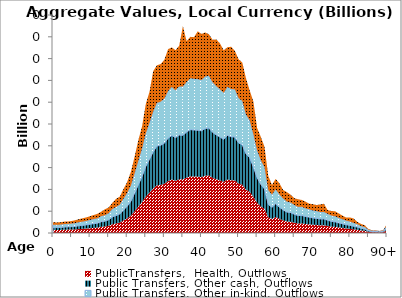
| Category | PublicTransfers,  Health, Outflows | Public Transfers, Other cash, Outflows | Public Transfers, Other in-kind, Outflows | Public Transfers, Education, Outflows |
|---|---|---|---|---|
| 0 | 2.731 | 2.25 | 2.478 | 2.452 |
|  | 2.744 | 2.26 | 2.489 | 2.201 |
| 2 | 2.826 | 2.328 | 2.564 | 2.172 |
| 3 | 2.982 | 2.457 | 2.705 | 2.274 |
| 4 | 3.1 | 2.554 | 2.812 | 2.103 |
| 5 | 3.17 | 2.611 | 2.875 | 2.311 |
| 6 | 3.329 | 2.742 | 3.019 | 2.653 |
| 7 | 3.641 | 2.999 | 3.302 | 2.783 |
| 8 | 3.832 | 3.156 | 3.476 | 3.053 |
| 9 | 4.082 | 3.362 | 3.703 | 3.218 |
| 10 | 4.401 | 3.625 | 3.992 | 3.378 |
| 11 | 4.707 | 3.877 | 4.27 | 3.681 |
| 12 | 4.965 | 4.089 | 4.504 | 4.091 |
| 13 | 5.682 | 4.68 | 5.154 | 4.089 |
| 14 | 5.973 | 4.92 | 5.418 | 5.479 |
| 15 | 6.666 | 5.49 | 6.046 | 5.256 |
| 16 | 8.071 | 6.648 | 7.321 | 5.601 |
| 17 | 8.764 | 7.219 | 7.95 | 7.408 |
| 18 | 9.546 | 7.863 | 8.659 | 7.331 |
| 19 | 11.568 | 9.528 | 10.493 | 8.731 |
| 20 | 13.449 | 11.078 | 12.2 | 10.243 |
| 21 | 16.017 | 13.193 | 14.529 | 12.494 |
| 22 | 20.075 | 16.535 | 18.21 | 15.435 |
| 23 | 24.273 | 19.993 | 22.018 | 18.892 |
| 24 | 28.42 | 23.409 | 25.78 | 20.321 |
| 25 | 33.443 | 27.546 | 30.336 | 27.054 |
| 26 | 37.021 | 30.493 | 33.581 | 28.393 |
| 27 | 40.812 | 33.615 | 37.02 | 36.985 |
| 28 | 43.721 | 36.012 | 39.659 | 34.493 |
| 29 | 44.122 | 36.342 | 40.023 | 34.492 |
| 30 | 45.158 | 37.195 | 40.962 | 35.577 |
| 31 | 47.679 | 39.272 | 43.249 | 38.376 |
| 32 | 49.086 | 40.431 | 44.525 | 36.282 |
| 33 | 47.941 | 39.488 | 43.487 | 36.846 |
| 34 | 49.247 | 40.563 | 44.672 | 37.316 |
| 35 | 49.197 | 40.522 | 44.626 | 55.442 |
| 36 | 50.75 | 41.802 | 46.035 | 37.433 |
| 37 | 51.993 | 42.825 | 47.162 | 37.976 |
| 38 | 51.788 | 42.656 | 46.977 | 38.232 |
| 39 | 51.707 | 42.59 | 46.903 | 43.861 |
| 40 | 51.393 | 42.331 | 46.618 | 42.289 |
| 41 | 52.577 | 43.307 | 47.693 | 40.352 |
| 42 | 52.822 | 43.508 | 47.914 | 38.149 |
| 43 | 50.645 | 41.715 | 45.94 | 38.942 |
| 44 | 49.36 | 40.656 | 44.774 | 42.843 |
| 45 | 48.265 | 39.755 | 43.781 | 42.113 |
| 46 | 47.082 | 38.78 | 42.708 | 39.04 |
| 47 | 49.096 | 40.439 | 44.535 | 36.359 |
| 48 | 48.396 | 39.863 | 43.9 | 38.696 |
| 49 | 48.25 | 39.742 | 43.767 | 35.385 |
| 50 | 45.349 | 37.353 | 41.136 | 35.615 |
| 51 | 44.371 | 36.547 | 40.248 | 35.279 |
| 52 | 39.813 | 32.793 | 36.114 | 33.194 |
| 53 | 37.869 | 31.192 | 34.351 | 27.337 |
| 54 | 33.144 | 27.3 | 30.065 | 30.131 |
| 55 | 27.802 | 22.9 | 25.219 | 20.465 |
| 56 | 24.449 | 20.138 | 22.178 | 21.39 |
| 57 | 22.129 | 18.227 | 20.073 | 18.642 |
| 58 | 14.428 | 11.884 | 13.088 | 13.047 |
| 59 | 12.921 | 10.643 | 11.721 | 8.813 |
| 60 | 14.67 | 12.083 | 13.307 | 9.552 |
| 61 | 12.983 | 10.694 | 11.777 | 10.182 |
| 62 | 11.621 | 9.572 | 10.541 | 7.789 |
| 63 | 10.563 | 8.701 | 9.582 | 8.694 |
| 64 | 10.269 | 8.458 | 9.315 | 7.191 |
| 65 | 9.443 | 7.778 | 8.566 | 6.201 |
| 66 | 8.77 | 7.223 | 7.955 | 7.017 |
| 67 | 8.832 | 7.275 | 8.011 | 6.255 |
| 68 | 8.298 | 6.835 | 7.527 | 6.177 |
| 69 | 7.978 | 6.572 | 7.237 | 5.149 |
| 70 | 7.583 | 6.246 | 6.879 | 5.727 |
| 71 | 7.38 | 6.079 | 6.695 | 5.515 |
| 72 | 7.053 | 5.809 | 6.397 | 6.931 |
| 73 | 7.062 | 5.817 | 6.406 | 7.563 |
| 74 | 6.451 | 5.314 | 5.852 | 3.407 |
| 75 | 5.863 | 4.829 | 5.318 | 4.171 |
| 76 | 5.628 | 4.635 | 5.105 | 4.604 |
| 77 | 5.085 | 4.188 | 4.613 | 4.036 |
| 78 | 4.632 | 3.815 | 4.202 | 3.32 |
| 79 | 4.154 | 3.422 | 3.768 | 2.811 |
| 80 | 3.853 | 3.174 | 3.495 | 3.771 |
| 81 | 3.395 | 2.797 | 3.08 | 4.034 |
| 82 | 2.986 | 2.46 | 2.709 | 2.016 |
| 83 | 2.344 | 1.931 | 2.126 | 1.921 |
| 84 | 1.996 | 1.644 | 1.81 | 1.703 |
| 85 | 1.11 | 0.915 | 1.007 | 0.606 |
| 86 | 0.735 | 0.606 | 0.667 | 0.444 |
| 87 | 0.694 | 0.571 | 0.629 | 0.367 |
| 88 | 0.564 | 0.465 | 0.512 | 0.287 |
| 89 | 0.783 | 0.645 | 0.71 | 0.482 |
| 90+ | 2.521 | 2.076 | 2.287 | 1.534 |